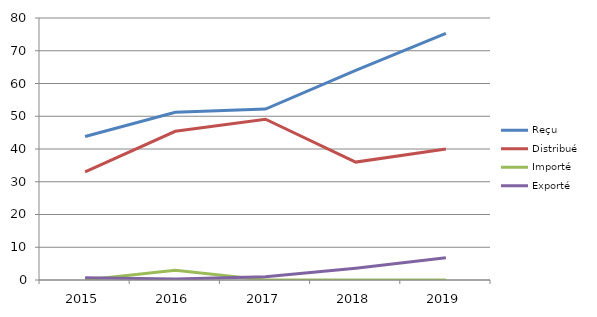
| Category | Reçu | Distribué | Importé | Exporté |
|---|---|---|---|---|
| 2015.0 | 43.8 | 33 | 0 | 0.7 |
| 2016.0 | 51.2 | 45.4 | 3 | 0.3 |
| 2017.0 | 52.2 | 49.1 | 0 | 1 |
| 2018.0 | 64 | 36 | 0 | 3.6 |
| 2019.0 | 75.3 | 40 | 0 | 6.8 |